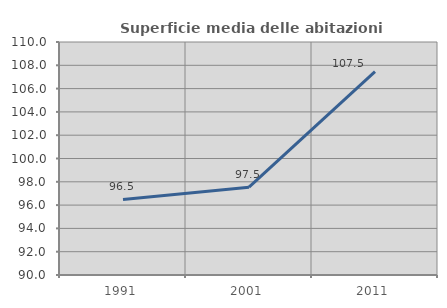
| Category | Superficie media delle abitazioni occupate |
|---|---|
| 1991.0 | 96.483 |
| 2001.0 | 97.542 |
| 2011.0 | 107.451 |